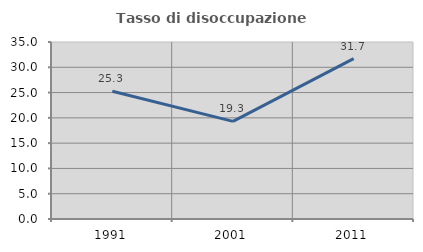
| Category | Tasso di disoccupazione giovanile  |
|---|---|
| 1991.0 | 25.255 |
| 2001.0 | 19.304 |
| 2011.0 | 31.727 |